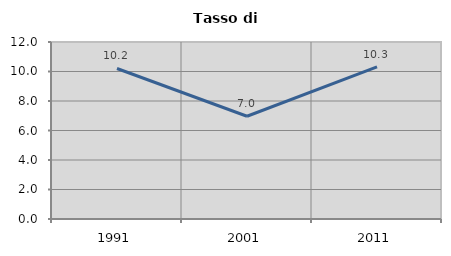
| Category | Tasso di disoccupazione   |
|---|---|
| 1991.0 | 10.205 |
| 2001.0 | 6.965 |
| 2011.0 | 10.307 |